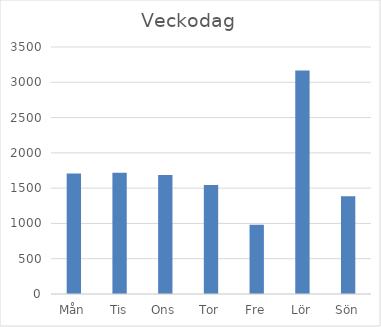
| Category | Summa |
|---|---|
| Mån | 1706 |
| Tis | 1719 |
| Ons | 1686 |
| Tor | 1544 |
| Fre | 981 |
| Lör | 3167 |
| Sön | 1386 |